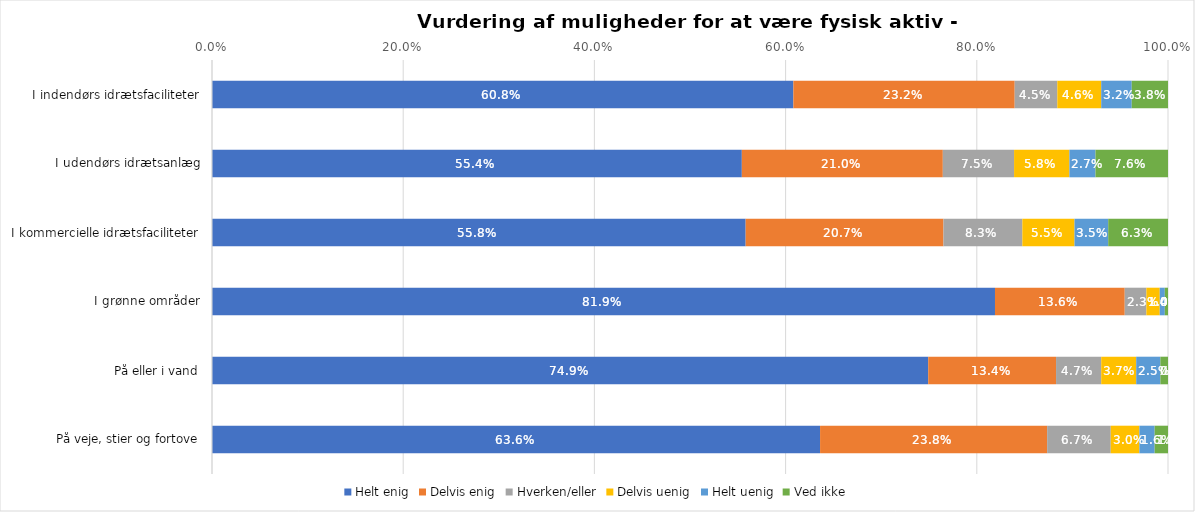
| Category | Helt enig | Delvis enig | Hverken/eller | Delvis uenig | Helt uenig | Ved ikke |
|---|---|---|---|---|---|---|
| I indendørs idrætsfaciliteter | 0.608 | 0.232 | 0.045 | 0.046 | 0.032 | 0.038 |
| I udendørs idrætsanlæg | 0.554 | 0.21 | 0.075 | 0.058 | 0.027 | 0.076 |
| I kommercielle idrætsfaciliteter | 0.558 | 0.207 | 0.083 | 0.055 | 0.035 | 0.063 |
| I grønne områder | 0.819 | 0.136 | 0.023 | 0.014 | 0.005 | 0.003 |
| På eller i vand | 0.749 | 0.134 | 0.047 | 0.037 | 0.025 | 0.008 |
| På veje, stier og fortove | 0.636 | 0.238 | 0.067 | 0.03 | 0.016 | 0.014 |